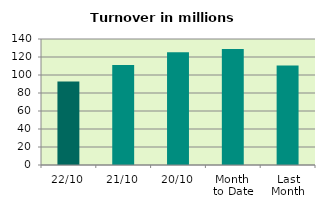
| Category | Series 0 |
|---|---|
| 22/10 | 92.646 |
| 21/10 | 111.039 |
| 20/10 | 125.412 |
| Month 
to Date | 128.778 |
| Last
Month | 110.611 |